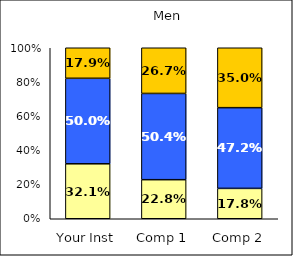
| Category | Low Job Satisfaction: Compensation | Average Job Satisfaction: Compensation | High Job Satisfaction: Compensation |
|---|---|---|---|
| Your Inst | 0.321 | 0.5 | 0.179 |
| Comp 1 | 0.228 | 0.504 | 0.267 |
| Comp 2 | 0.178 | 0.472 | 0.35 |